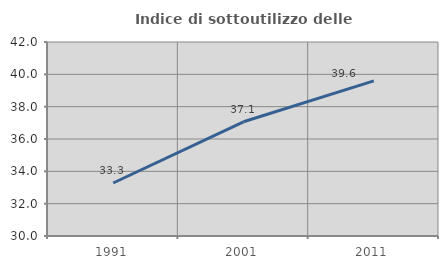
| Category | Indice di sottoutilizzo delle abitazioni  |
|---|---|
| 1991.0 | 33.277 |
| 2001.0 | 37.065 |
| 2011.0 | 39.597 |